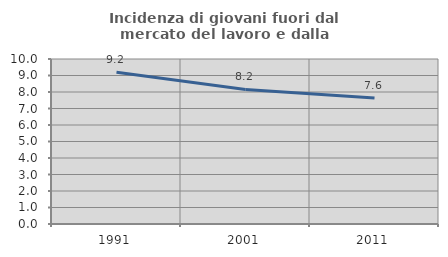
| Category | Incidenza di giovani fuori dal mercato del lavoro e dalla formazione  |
|---|---|
| 1991.0 | 9.194 |
| 2001.0 | 8.158 |
| 2011.0 | 7.634 |